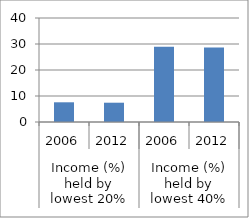
| Category | Series 0 |
|---|---|
| 0 | 7.58 |
| 1 | 7.42 |
| 2 | 28.93 |
| 3 | 28.65 |